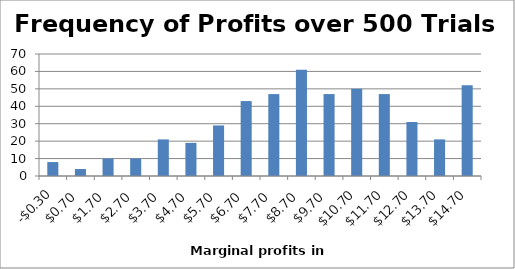
| Category | Series 0 |
|---|---|
| -0.3 | 8 |
| 0.7 | 4 |
| 1.7 | 10 |
| 2.7 | 10 |
| 3.7 | 21 |
| 4.7 | 19 |
| 5.7 | 29 |
| 6.7 | 43 |
| 7.7 | 47 |
| 8.7 | 61 |
| 9.7 | 47 |
| 10.7 | 50 |
| 11.7 | 47 |
| 12.7 | 31 |
| 13.7 | 21 |
| 14.7 | 52 |